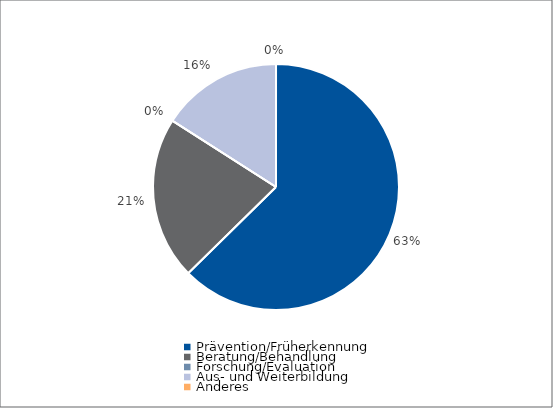
| Category | Series 0 |
|---|---|
| Prävention/Früherkennung | 7823 |
| Beratung/Behandlung | 2674.1 |
| Forschung/Evaluation | 0 |
| Aus- und Weiterbildung | 1991.6 |
| Anderes | 0 |